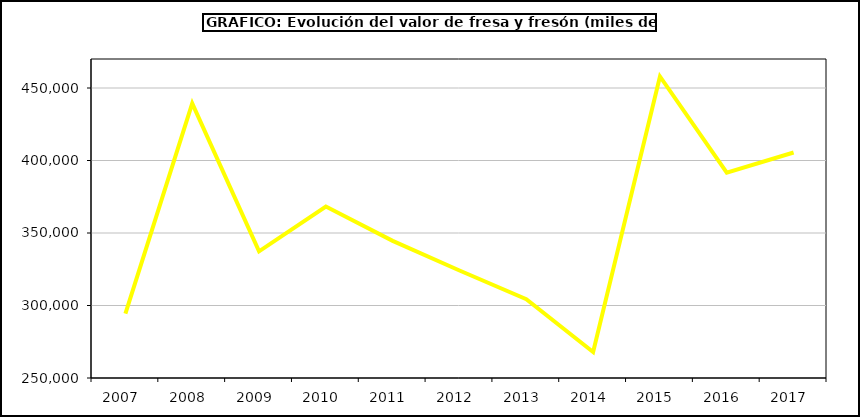
| Category | Valor |
|---|---|
| 2007.0 | 294464.98 |
| 2008.0 | 439353.128 |
| 2009.0 | 337386.548 |
| 2010.0 | 368287.313 |
| 2011.0 | 344604.077 |
| 2012.0 | 324144.524 |
| 2013.0 | 304404.377 |
| 2014.0 | 267944.247 |
| 2015.0 | 457982 |
| 2016.0 | 391643 |
| 2017.0 | 405540.083 |